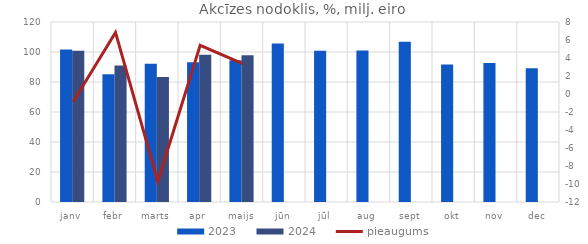
| Category | 2023 | 2024 |
|---|---|---|
| janv | 101.657 | 100.784 |
| febr | 85.2 | 91.033 |
| marts | 92.239 | 83.272 |
| apr | 93.144 | 98.179 |
| maijs | 94.582 | 97.762 |
| jūn | 105.706 | 0 |
| jūl | 100.823 | 0 |
| aug | 101.01 | 0 |
| sept | 106.898 | 0 |
| okt | 91.658 | 0 |
| nov | 92.614 | 0 |
| dec | 89.239 | 0 |